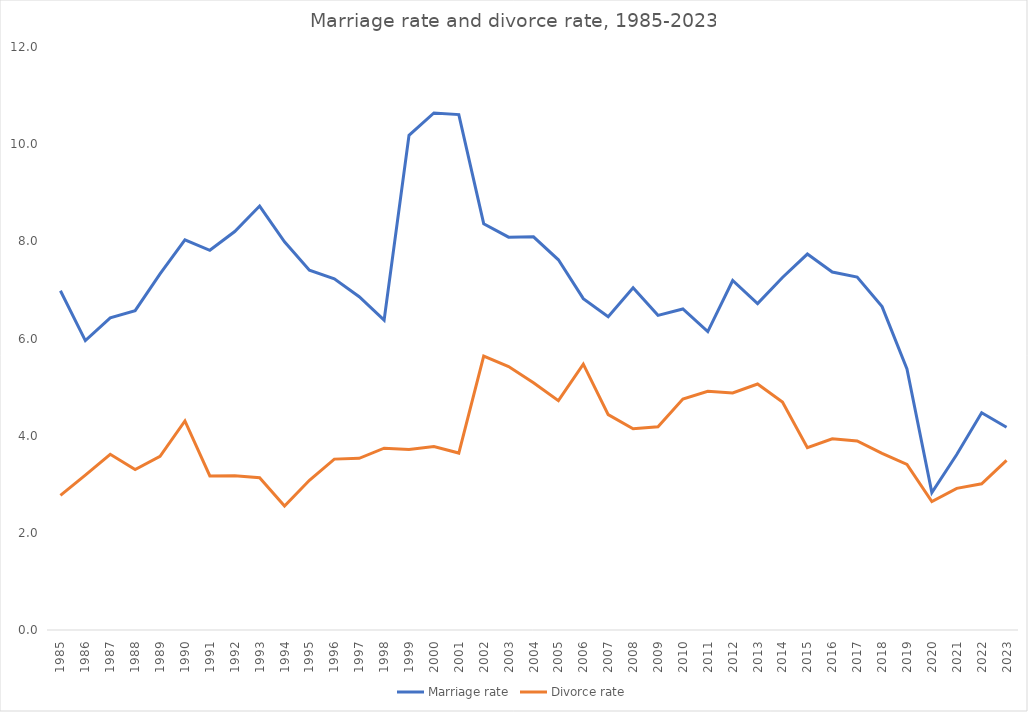
| Category | Marriage rate | Divorce rate |
|---|---|---|
| 1985.0 | 6.982 | 2.77 |
| 1986.0 | 5.957 | 3.187 |
| 1987.0 | 6.423 | 3.617 |
| 1988.0 | 6.573 | 3.303 |
| 1989.0 | 7.329 | 3.574 |
| 1990.0 | 8.031 | 4.303 |
| 1991.0 | 7.815 | 3.172 |
| 1992.0 | 8.202 | 3.174 |
| 1993.0 | 8.726 | 3.135 |
| 1994.0 | 7.99 | 2.552 |
| 1995.0 | 7.406 | 3.083 |
| 1996.0 | 7.227 | 3.517 |
| 1997.0 | 6.86 | 3.534 |
| 1998.0 | 6.376 | 3.742 |
| 1999.0 | 10.183 | 3.714 |
| 2000.0 | 10.642 | 3.775 |
| 2001.0 | 10.608 | 3.642 |
| 2002.0 | 8.363 | 5.637 |
| 2003.0 | 8.086 | 5.423 |
| 2004.0 | 8.093 | 5.087 |
| 2005.0 | 7.62 | 4.722 |
| 2006.0 | 6.821 | 5.473 |
| 2007.0 | 6.45 | 4.433 |
| 2008.0 | 7.045 | 4.142 |
| 2009.0 | 6.476 | 4.183 |
| 2010.0 | 6.609 | 4.753 |
| 2011.0 | 6.141 | 4.913 |
| 2012.0 | 7.194 | 4.879 |
| 2013.0 | 6.719 | 5.063 |
| 2014.0 | 7.256 | 4.691 |
| 2015.0 | 7.738 | 3.753 |
| 2016.0 | 7.367 | 3.936 |
| 2017.0 | 7.265 | 3.89 |
| 2018.0 | 6.657 | 3.636 |
| 2019.0 | 5.375 | 3.407 |
| 2020.0 | 2.827 | 2.643 |
| 2021.0 | 3.612 | 2.915 |
| 2022.0 | 4.473 | 3.01 |
| 2023.0 | 4.173 | 3.493 |